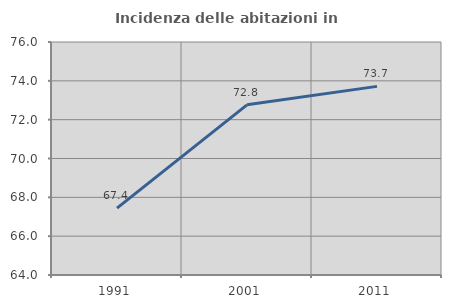
| Category | Incidenza delle abitazioni in proprietà  |
|---|---|
| 1991.0 | 67.442 |
| 2001.0 | 72.765 |
| 2011.0 | 73.715 |